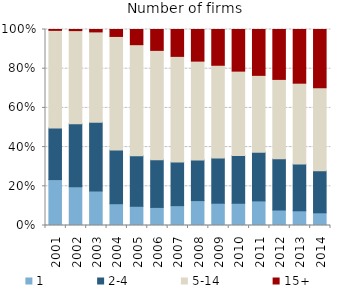
| Category | 1 | 2-4 | 5-14 | 15+ |
|---|---|---|---|---|
| 2001.0 | 23.426 | 26.349 | 49.787 | 0.438 |
| 2002.0 | 19.762 | 32.196 | 47.475 | 0.568 |
| 2003.0 | 17.605 | 35.074 | 46.1 | 1.221 |
| 2004.0 | 11.12 | 27.406 | 57.934 | 3.54 |
| 2005.0 | 9.817 | 25.814 | 56.624 | 7.745 |
| 2006.0 | 9.231 | 24.331 | 55.786 | 10.653 |
| 2007.0 | 10.131 | 22.245 | 53.911 | 13.712 |
| 2008.0 | 12.708 | 20.72 | 50.44 | 16.131 |
| 2009.0 | 11.372 | 23.047 | 47.336 | 18.245 |
| 2010.0 | 11.354 | 24.335 | 43.071 | 21.239 |
| 2011.0 | 12.555 | 24.876 | 39.175 | 23.394 |
| 2012.0 | 7.903 | 26.149 | 40.493 | 25.455 |
| 2013.0 | 7.503 | 23.853 | 41.256 | 27.388 |
| 2014.0 | 6.477 | 21.465 | 42.342 | 29.715 |